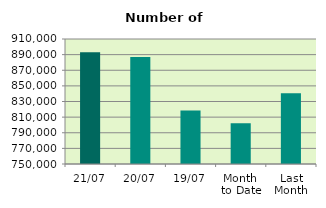
| Category | Series 0 |
|---|---|
| 21/07 | 892968 |
| 20/07 | 886972 |
| 19/07 | 818344 |
| Month 
to Date | 802162.8 |
| Last
Month | 840506.364 |